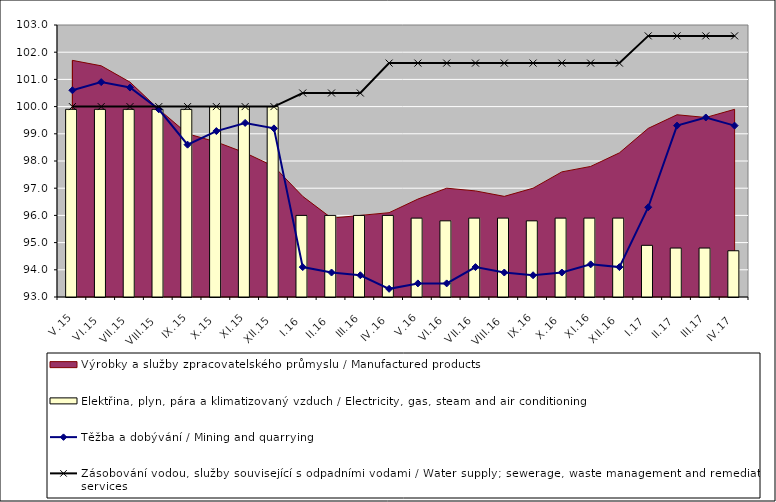
| Category | Elektřina, plyn, pára a klimatizovaný vzduch / Electricity, gas, steam and air conditioning |
|---|---|
| V.15 | 99.9 |
| VI.15 | 99.9 |
| VII.15 | 99.9 |
| VIII.15 | 99.9 |
| IX.15 | 99.9 |
| X.15 | 100 |
| XI.15 | 100 |
| XII.15 | 100 |
| I.16 | 96 |
| II.16 | 96 |
| III.16 | 96 |
| IV.16 | 96 |
| V.16 | 95.9 |
| VI.16 | 95.8 |
| VII.16 | 95.9 |
| VIII.16 | 95.9 |
| IX.16 | 95.8 |
| X.16 | 95.9 |
| XI.16 | 95.9 |
| XII.16 | 95.9 |
| I.17 | 94.9 |
| II.17 | 94.8 |
| III.17 | 94.8 |
| IV.17 | 94.7 |